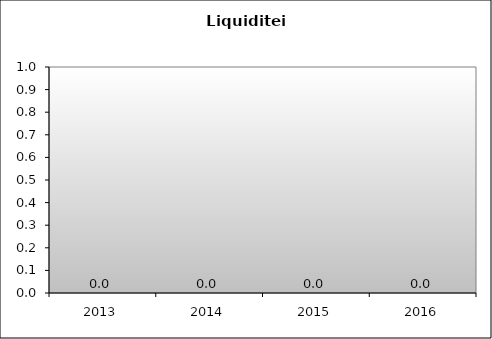
| Category | Series 0 |
|---|---|
| 2013.0 | 0 |
| 2014.0 | 0 |
| 2015.0 | 0 |
| 2016.0 | 0 |